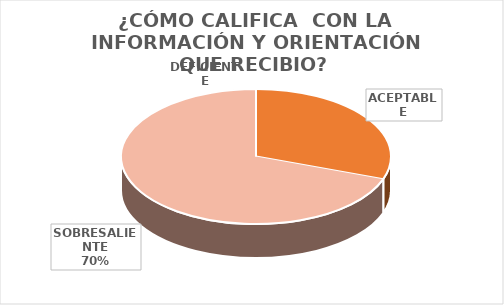
| Category | Series 0 |
|---|---|
| DEFICIENTE | 0 |
| ACEPTABLE | 14 |
| SOBRESALIENTE | 32 |